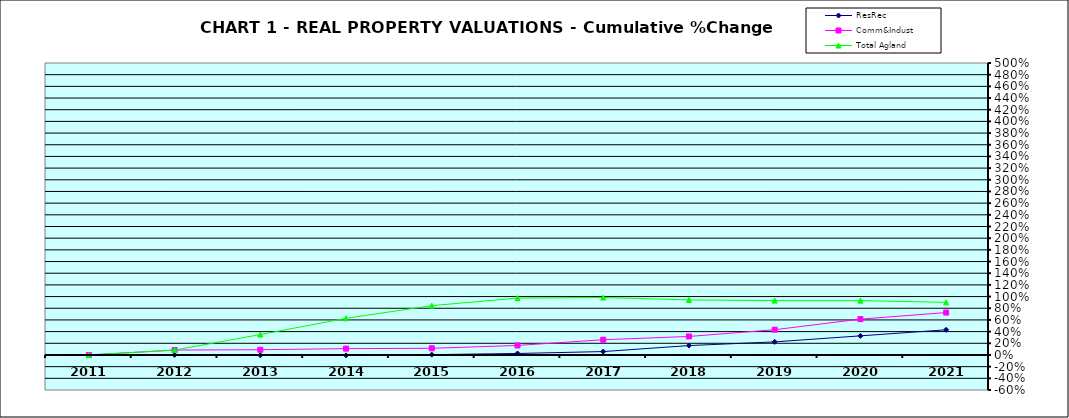
| Category | ResRec | Comm&Indust | Total Agland |
|---|---|---|---|
| 2011.0 | 0 | 0 | 0 |
| 2012.0 | 0.001 | 0.084 | 0.083 |
| 2013.0 | -0.006 | 0.09 | 0.35 |
| 2014.0 | -0.007 | 0.108 | 0.628 |
| 2015.0 | 0.005 | 0.114 | 0.845 |
| 2016.0 | 0.025 | 0.163 | 0.974 |
| 2017.0 | 0.058 | 0.261 | 0.983 |
| 2018.0 | 0.161 | 0.317 | 0.943 |
| 2019.0 | 0.224 | 0.432 | 0.931 |
| 2020.0 | 0.327 | 0.613 | 0.93 |
| 2021.0 | 0.431 | 0.726 | 0.901 |